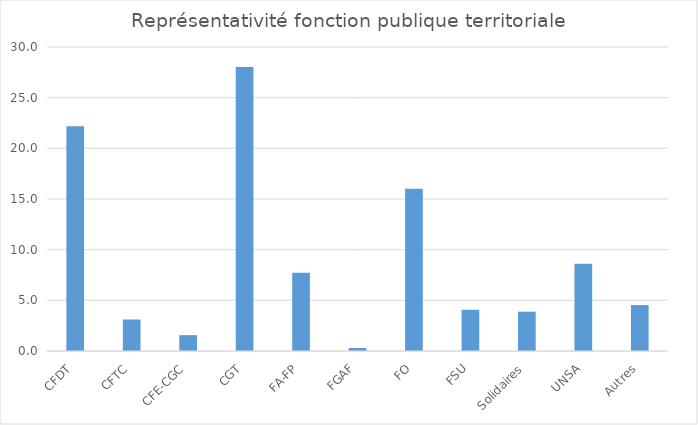
| Category | Series 0 |
|---|---|
| CFDT | 22.176 |
| CFTC | 3.108 |
| CFE-CGC | 1.563 |
| CGT | 28.021 |
| FA-FP | 7.718 |
| FGAF | 0.296 |
| FO | 16.014 |
| FSU | 4.072 |
| Solidaires | 3.879 |
| UNSA | 8.62 |
| Autres | 4.532 |